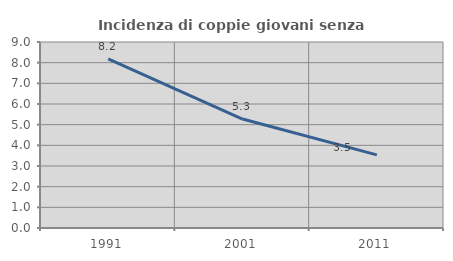
| Category | Incidenza di coppie giovani senza figli |
|---|---|
| 1991.0 | 8.179 |
| 2001.0 | 5.271 |
| 2011.0 | 3.538 |